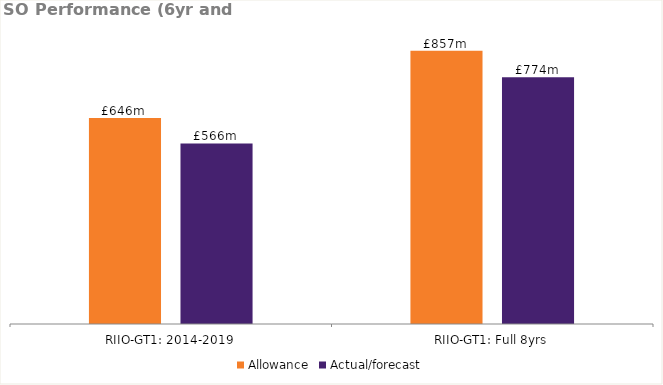
| Category | Allowance | Actual/forecast |
|---|---|---|
| RIIO-GT1: 2014-2019 | 646 | 566.1 |
| RIIO-GT1: Full 8yrs | 857 | 774 |